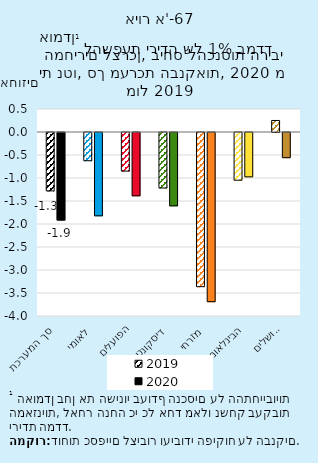
| Category | 2019 | 2020 |
|---|---|---|
| סך המערכת | -1.269 | -1.903 |
| לאומי | -0.614 | -1.811 |
| הפועלים | -0.839 | -1.376 |
| דיסקונט | -1.206 | -1.594 |
| מזרחי | -3.351 | -3.677 |
| הבינלאומי | -1.037 | -0.964 |
| ירושלים | 0.25 | -0.547 |